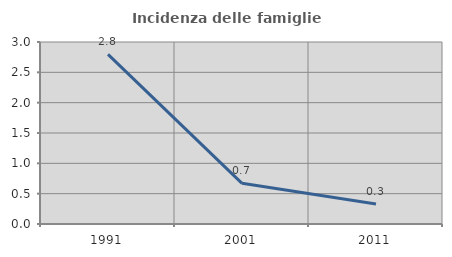
| Category | Incidenza delle famiglie numerose |
|---|---|
| 1991.0 | 2.797 |
| 2001.0 | 0.67 |
| 2011.0 | 0.329 |